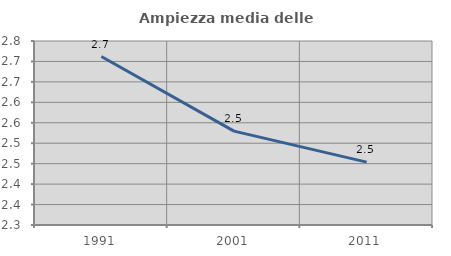
| Category | Ampiezza media delle famiglie |
|---|---|
| 1991.0 | 2.712 |
| 2001.0 | 2.53 |
| 2011.0 | 2.454 |